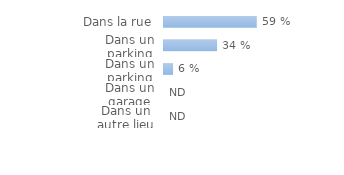
| Category | Series 0 |
|---|---|
| Dans un autre lieu | 0 |
| Dans un garage | 0 |
| Dans un parking fermé | 0.057 |
| Dans un parking ouvert | 0.336 |
| Dans la rue | 0.587 |